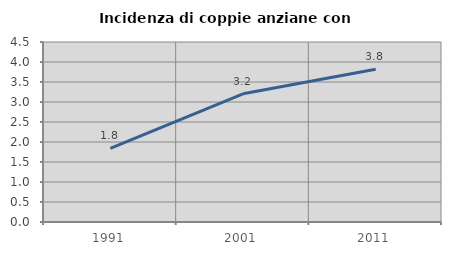
| Category | Incidenza di coppie anziane con figli |
|---|---|
| 1991.0 | 1.842 |
| 2001.0 | 3.204 |
| 2011.0 | 3.817 |